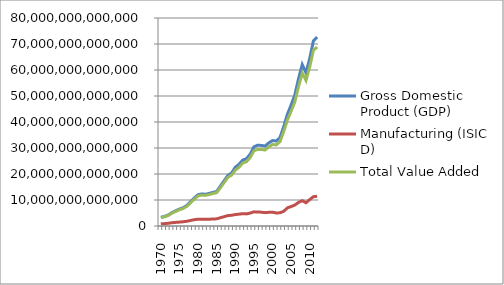
| Category | Gross Domestic Product (GDP) | Manufacturing (ISIC D) | Total Value Added |
|---|---|---|---|
| 1970.0 | 3355631228337.592 | 836383855925.063 | 3218595827651.886 |
| 1971.0 | 3691115894580.98 | 904601709315.64 | 3536214109009.44 |
| 1972.0 | 4244919710661.466 | 1038888126181.79 | 4068032611655.868 |
| 1973.0 | 5164068920178.461 | 1265723842282.763 | 4952006965416.903 |
| 1974.0 | 5837783957788.915 | 1399398120638.072 | 5600783419608.722 |
| 1975.0 | 6524306326269.396 | 1507001073834.83 | 6252204664318.908 |
| 1976.0 | 7042408186419.142 | 1628937841274.135 | 6742298651606.247 |
| 1977.0 | 7918956494686.39 | 1820158347573.686 | 7590524078918.405 |
| 1978.0 | 9382136109114.59 | 2149272512247.322 | 8994299969094.13 |
| 1979.0 | 10796199287849.604 | 2435701449569.041 | 10333962693734.514 |
| 1980.0 | 12043216313451.662 | 2614593408547.892 | 11562727868374.133 |
| 1981.0 | 12323537708603.398 | 2635850091709.288 | 11882636079154.578 |
| 1982.0 | 12223115168740.633 | 2581770865000.714 | 11815787461832.463 |
| 1983.0 | 12540892613762.367 | 2595753990277.057 | 12093899201348.428 |
| 1984.0 | 12918840700913.844 | 2693861031279.906 | 12496282854713.527 |
| 1985.0 | 13285882106006.508 | 2751421588217.156 | 12830467413152.93 |
| 1986.0 | 15353799147853.348 | 3183945842171.51 | 14723520200180.254 |
| 1987.0 | 17387231207560.498 | 3581302334504.472 | 16713432115702.574 |
| 1988.0 | 19438083379362.387 | 4008649448513.282 | 18693698861439.14 |
| 1989.0 | 20355959752821.977 | 4119983607731.9 | 19552671722305.81 |
| 1990.0 | 22595357994390 | 4402820326746.089 | 21462663643010.508 |
| 1991.0 | 23710647305927.01 | 4555774193574.201 | 22578481603389.746 |
| 1992.0 | 25366624448697.46 | 4720356201553.813 | 24209702892087.516 |
| 1993.0 | 25866212803811.977 | 4658428571899.276 | 24721809193395.805 |
| 1994.0 | 27610498783886.438 | 4960952193289.096 | 26287875441914.87 |
| 1995.0 | 30454517428654.992 | 5439992300984.354 | 28898009032684.15 |
| 1996.0 | 31079757217105.34 | 5399804151966.997 | 29476618273285.207 |
| 1997.0 | 30989037754760.934 | 5319569254126.711 | 29415541222031.176 |
| 1998.0 | 30753804293141.7 | 5129639636761.246 | 29232497535759.008 |
| 1999.0 | 31952428724349.348 | 5265189486414.198 | 30418453331318.953 |
| 2000.0 | 32859658097141.426 | 5330383542588.36 | 31352939652619.27 |
| 2001.0 | 32672873825408.92 | 4996801737292.536 | 31190280046095.414 |
| 2002.0 | 33990572177724.67 | 5090565663705.719 | 32413867059398.08 |
| 2003.0 | 38156597670783.33 | 5623947274963.689 | 36267651663720.125 |
| 2004.0 | 42949906739999.67 | 6968378014583.405 | 40743660567349.76 |
| 2005.0 | 46509522888835.39 | 7479518564888.544 | 44117046383902.42 |
| 2006.0 | 50386809932957.78 | 8056225982139.772 | 47700765813529.11 |
| 2007.0 | 56676991135031.08 | 9069975350566.27 | 53609885588489.17 |
| 2008.0 | 62100871596041.58 | 9743920931913.049 | 58831071155170.04 |
| 2009.0 | 58949873264349.734 | 8945728039850.453 | 55981672796916.81 |
| 2010.0 | 64406368101650.19 | 10168401279663.527 | 61173658358164.664 |
| 2011.0 | 71218928879963.64 | 11284339739333.484 | 67589015331151.734 |
| 2012.0 | 72689733756135.77 | 11426601399836.621 | 68832035666684.07 |